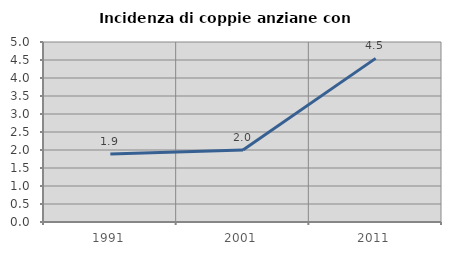
| Category | Incidenza di coppie anziane con figli |
|---|---|
| 1991.0 | 1.887 |
| 2001.0 | 2 |
| 2011.0 | 4.545 |